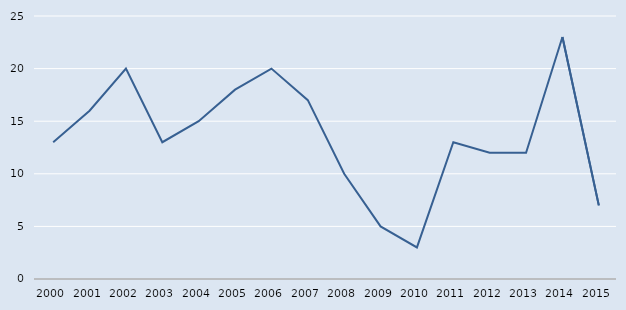
| Category | Series 0 |
|---|---|
| 2000.0 | 13 |
| 2001.0 | 16 |
| 2002.0 | 20 |
| 2003.0 | 13 |
| 2004.0 | 15 |
| 2005.0 | 18 |
| 2006.0 | 20 |
| 2007.0 | 17 |
| 2008.0 | 10 |
| 2009.0 | 5 |
| 2010.0 | 3 |
| 2011.0 | 13 |
| 2012.0 | 12 |
| 2013.0 | 12 |
| 2014.0 | 23 |
| 2015.0 | 7 |